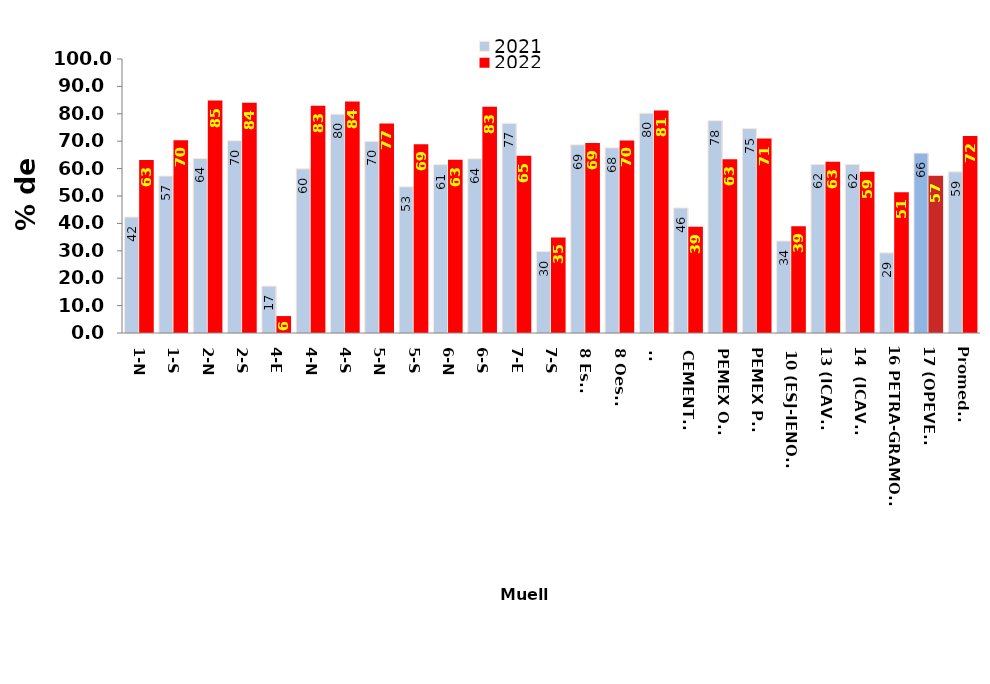
| Category | 2021 | 2022 |
|---|---|---|
| 1-N | 42.327 | 63.113 |
| 1-S | 57.296 | 70.337 |
| 2-N | 63.702 | 84.834 |
| 2-S | 70.203 | 84.057 |
| 4-E | 17.124 | 6.182 |
| 4-N | 59.911 | 82.975 |
| 4-S | 79.88 | 84.482 |
| 5-N | 69.953 | 76.501 |
| 5-S | 53.362 | 68.85 |
| 6-N | 61.451 | 63.204 |
| 6-S | 63.602 | 82.542 |
| 7-E | 76.54 | 64.655 |
| 7-S | 29.731 | 34.894 |
| 8 Este | 68.69 | 69.324 |
| 8 Oeste | 67.602 | 70.26 |
| 9- | 80.227 | 81.242 |
| CEMENTOS | 45.663 | 38.764 |
| PEMEX OTE | 77.505 | 63.376 |
| PEMEX PTE | 74.618 | 70.974 |
| 10 (ESJ-IENOVA) | 33.592 | 38.966 |
| 13 (ICAVE) | 61.561 | 62.539 |
| 14  (ICAVE) | 61.561 | 58.842 |
| 16 PETRA-GRAMOSA | 29.26 | 51.385 |
| 17 (OPEVER) | 65.661 | 57.388 |
| Promedio | 58.81 | 71.884 |